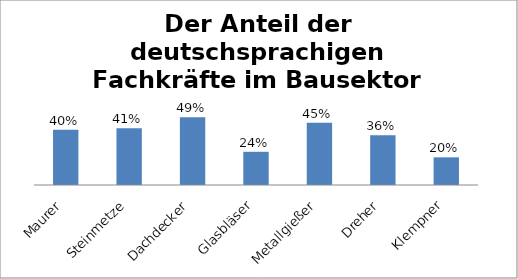
| Category | deutschsprachige Fachkräfte im Bausektor |
|---|---|
| Maurer | 0.4 |
| Steinmetze | 0.41 |
| Dachdecker | 0.49 |
| Glasbläser | 0.24 |
| Metallgießer | 0.45 |
| Dreher | 0.36 |
| Klempner | 0.2 |